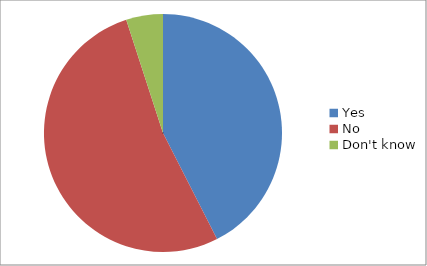
| Category | Series 0 |
|---|---|
| Yes | 17 |
| No | 21 |
| Don't know | 2 |